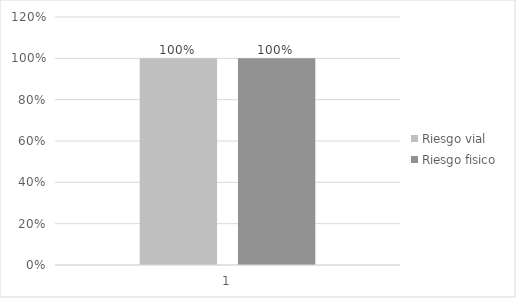
| Category | Riesgo vial | Riesgo fisico |
|---|---|---|
| 0 | 1 | 1 |